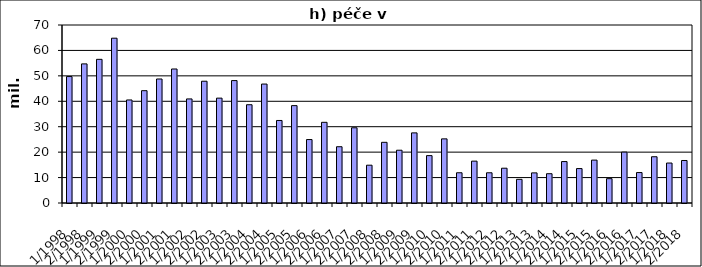
| Category | Series 0 |
|---|---|
| 1/1998 | 49724.254 |
| 2/1998 | 54710.746 |
| 1/1999 | 56499.941 |
| 2/1999 | 64809.059 |
| 1/2000 | 40521.101 |
| 2/2000 | 44172.899 |
| 1/2001 | 48766.508 |
| 2/2001 | 52697.871 |
| 1/2002 | 40926 |
| 2/2002 | 47887 |
| 1/2003 | 41239 |
| 2/2003 | 48142.441 |
| 1/2004 | 38646.413 |
| 2/2004 | 46777.432 |
| 1/2005 | 32454 |
| 2/2005 | 38289.082 |
| 1/2006 | 24952 |
| 2/2006 | 31726 |
| 1/2007 | 22129 |
| 2/2007 | 29583 |
| 1/2008 | 14865.507 |
| 2/2008 | 23863.493 |
| 1/2009 | 20755.827 |
| 2/2009 | 27574 |
| 1/2010 | 18636 |
| 2/2010 | 25221 |
| 1/2011 | 11894 |
| 2/2011 | 16462 |
| 1/2012 | 11886 |
| 2/2012 | 13684 |
| 1/2013 | 9308 |
| 2/2013 | 11841 |
| 1/2014 | 11516 |
| 2/2014 | 16291 |
| 1/2015 | 13537 |
| 2/2015 | 16872 |
| 1/2016 | 9573 |
| 2/2016 | 20018 |
| 1/2017 | 11972 |
| 2/2017 | 18190 |
| 1/2018 | 15715.84 |
| 2/2018 | 16717.126 |